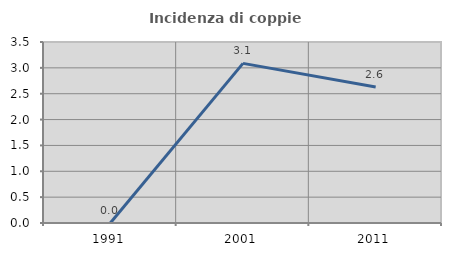
| Category | Incidenza di coppie miste |
|---|---|
| 1991.0 | 0 |
| 2001.0 | 3.086 |
| 2011.0 | 2.632 |